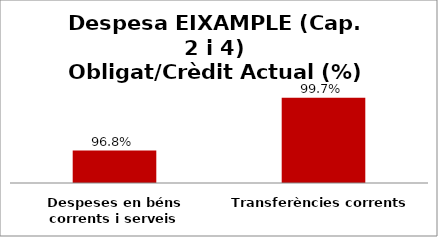
| Category | Series 0 |
|---|---|
| Despeses en béns corrents i serveis | 0.968 |
| Transferències corrents | 0.997 |